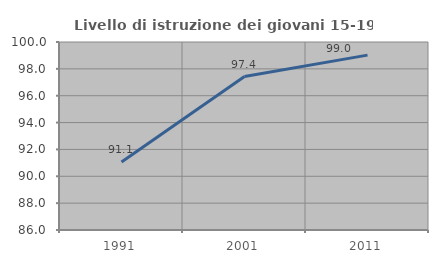
| Category | Livello di istruzione dei giovani 15-19 anni |
|---|---|
| 1991.0 | 91.061 |
| 2001.0 | 97.43 |
| 2011.0 | 99.022 |